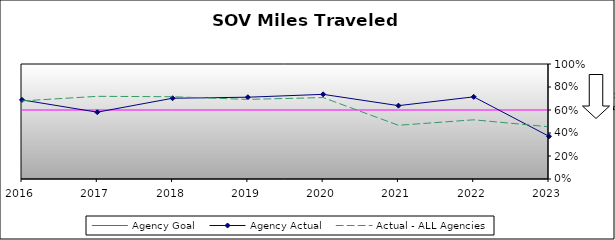
| Category | Agency Goal | Agency Actual | Actual - ALL Agencies |
|---|---|---|---|
| 2016.0 | 0.6 | 0.688 | 0.679 |
| 2017.0 | 0.6 | 0.581 | 0.719 |
| 2018.0 | 0.6 | 0.702 | 0.715 |
| 2019.0 | 0.6 | 0.711 | 0.692 |
| 2020.0 | 0.6 | 0.736 | 0.708 |
| 2021.0 | 0.6 | 0.638 | 0.467 |
| 2022.0 | 0.6 | 0.714 | 0.515 |
| 2023.0 | 0.6 | 0.371 | 0.454 |